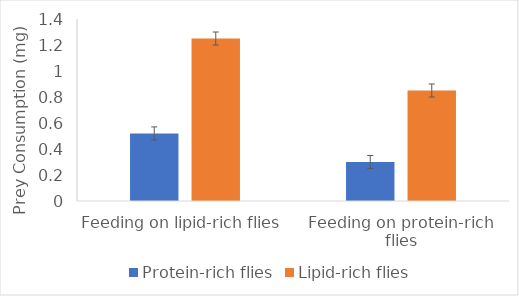
| Category | Protein-rich flies | Lipid-rich flies |
|---|---|---|
| Feeding on lipid-rich flies | 0.52 | 1.25 |
| Feeding on protein-rich flies | 0.3 | 0.85 |